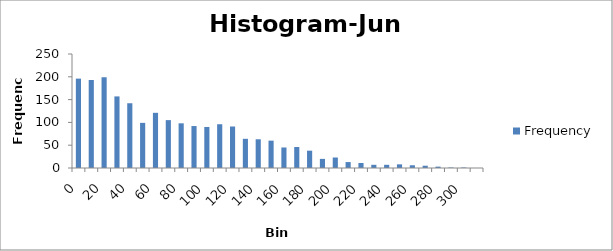
| Category | Frequency |
|---|---|
| 0 | 196 |
| 10 | 193 |
| 20 | 199 |
| 30 | 157 |
| 40 | 142 |
| 50 | 99 |
| 60 | 121 |
| 70 | 105 |
| 80 | 98 |
| 90 | 92 |
| 100 | 90 |
| 110 | 96 |
| 120 | 91 |
| 130 | 64 |
| 140 | 63 |
| 150 | 60 |
| 160 | 45 |
| 170 | 46 |
| 180 | 38 |
| 190 | 20 |
| 200 | 23 |
| 210 | 13 |
| 220 | 11 |
| 230 | 7 |
| 240 | 7 |
| 250 | 8 |
| 260 | 6 |
| 270 | 5 |
| 280 | 3 |
| 290 | 1 |
| 300 | 1 |
| More | 0 |